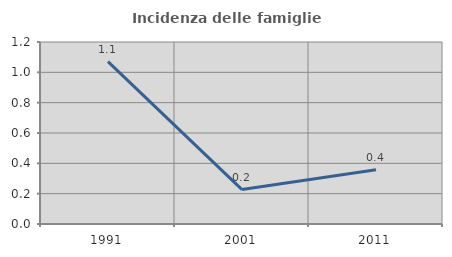
| Category | Incidenza delle famiglie numerose |
|---|---|
| 1991.0 | 1.071 |
| 2001.0 | 0.227 |
| 2011.0 | 0.358 |